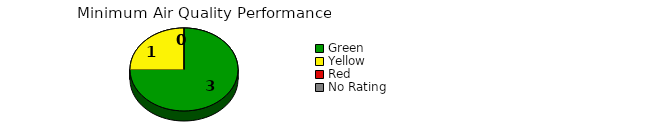
| Category | Counts |
|---|---|
| Green | 3 |
| Yellow | 1 |
| Red | 0 |
| No Rating | 0 |